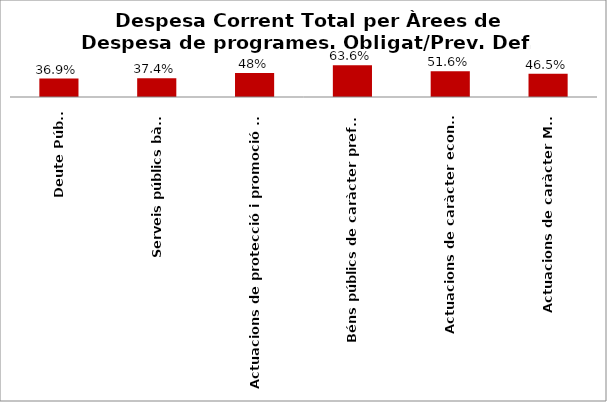
| Category | Series 0 |
|---|---|
| Deute Públic | 0.369 |
| Serveis públics bàsics | 0.374 |
| Actuacions de protecció i promoció social | 0.479 |
| Béns públics de caràcter preferent | 0.636 |
| Actuacions de caràcter econòmic | 0.516 |
| Actuacions de caràcter Marçal | 0.465 |